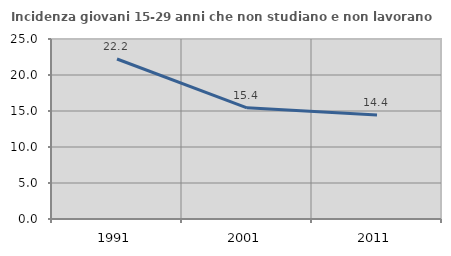
| Category | Incidenza giovani 15-29 anni che non studiano e non lavorano  |
|---|---|
| 1991.0 | 22.222 |
| 2001.0 | 15.442 |
| 2011.0 | 14.428 |